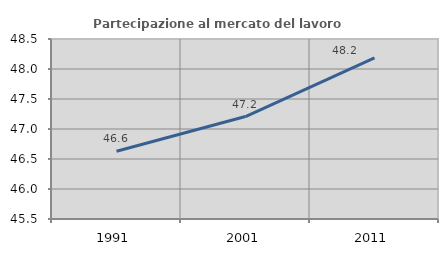
| Category | Partecipazione al mercato del lavoro  femminile |
|---|---|
| 1991.0 | 46.63 |
| 2001.0 | 47.207 |
| 2011.0 | 48.187 |